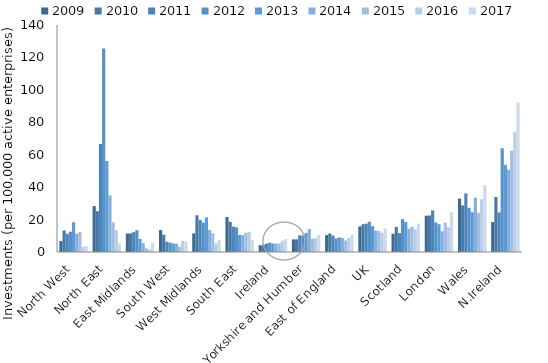
| Category | 2009 | 2010 | 2011 | 2012 | 2013 | 2014 | 2015 | 2016 | 2017 |
|---|---|---|---|---|---|---|---|---|---|
| North West | 6.777 | 13.263 | 11.239 | 12.478 | 18.328 | 11.224 | 12.32 | 3.255 | 3.54 |
| North East | 28.275 | 25.191 | 66.624 | 125.539 | 56.154 | 34.896 | 18.307 | 13.493 | 5.279 |
| East Midlands | 11.384 | 11.463 | 12.237 | 13.445 | 8.07 | 5.378 | 2.27 | 1.636 | 5.355 |
| South West | 13.523 | 10.636 | 6.327 | 5.818 | 5.23 | 5.095 | 3.153 | 6.824 | 6.305 |
| West Midlands | 11.485 | 22.634 | 19.779 | 18.141 | 21.34 | 13.584 | 11.54 | 5.364 | 7.464 |
| South East | 21.566 | 18.552 | 15.676 | 15.238 | 10.521 | 10.42 | 11.897 | 12.32 | 7.62 |
| Ireland | 4.2 | 4.447 | 5.147 | 5.707 | 5.285 | 5.121 | 5.144 | 6.999 | 7.896 |
| Yorkshire and Humber | 7.793 | 7.773 | 10.327 | 10.251 | 11.751 | 14.137 | 8.146 | 8.686 | 10.534 |
| East of England | 10.463 | 11.373 | 10.143 | 8.384 | 8.964 | 8.65 | 7.16 | 8.694 | 10.544 |
| UK | 15.756 | 17.139 | 17.459 | 18.669 | 15.967 | 13.133 | 12.986 | 11.821 | 14.411 |
| Scotland | 11.264 | 15.415 | 11.564 | 20.212 | 18.492 | 14.298 | 15.617 | 14.011 | 17.524 |
| London | 22.371 | 22.504 | 25.642 | 18.206 | 17.162 | 12.779 | 18.104 | 15.206 | 24.44 |
| Wales | 32.922 | 28.75 | 36.121 | 27.277 | 24.513 | 33.533 | 24.208 | 32.505 | 41.19 |
| N.Ireland | 18.425 | 33.907 | 24.403 | 63.994 | 53.783 | 50.688 | 62.433 | 74.106 | 92.191 |